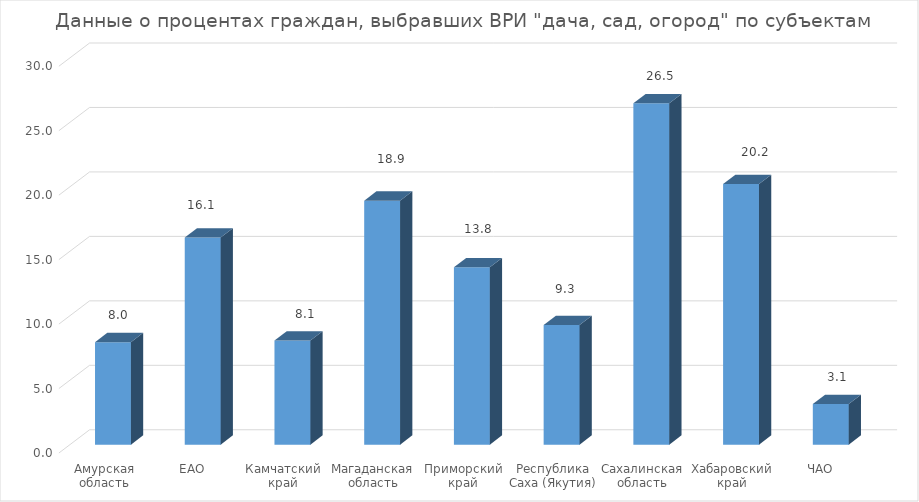
| Category | дача, сад, огород |
|---|---|
| Амурская область | 7.952 |
| ЕАО | 16.071 |
| Камчатский край | 8.073 |
| Магаданская область | 18.927 |
| Приморский край | 13.764 |
| Республика Саха (Якутия) | 9.274 |
| Сахалинская область | 26.485 |
| Хабаровский край | 20.222 |
| ЧАО | 3.15 |